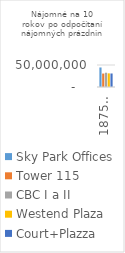
| Category | Sky Park Offices | Tower 115 | CBC I a II | Westend Plaza | Court+Plazza |
|---|---|---|---|---|---|
| 18756,44 m2 | 44390563.8 | 30562244.266 | 32412924.144 | 30987460.742 | 30706660.742 |